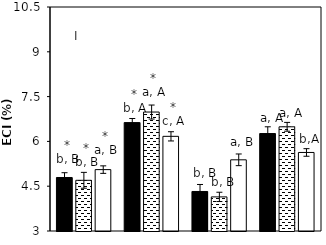
| Category |    A. brasilense |    A. chroococcum |    CK |
|---|---|---|---|
| aCO2-Bt | 4.791 | 4.697 | 5.055 |
| aCO2-XIANYU | 6.63 | 6.983 | 6.169 |
| eCO2-Bt | 4.323 | 4.142 | 5.383 |
| eCO2-XIANYU | 6.263 | 6.489 | 5.63 |